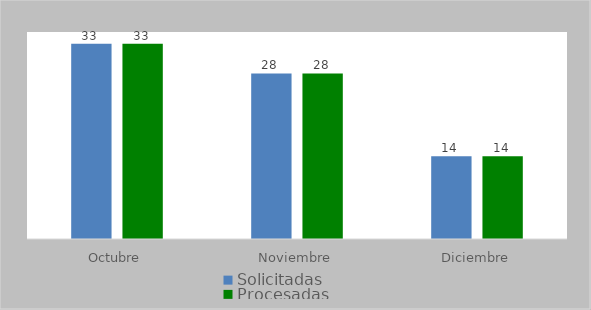
| Category | Solicitadas | Procesadas |
|---|---|---|
| Octubre | 33 | 33 |
| Noviembre | 28 | 28 |
| Diciembre | 14 | 14 |